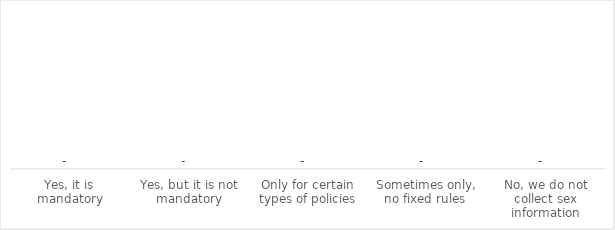
| Category | Series 0 |
|---|---|
| Yes, it is mandatory | 0 |
| Yes, but it is not mandatory | 0 |
| Only for certain types of policies | 0 |
| Sometimes only, no fixed rules  | 0 |
| No, we do not collect sex information | 0 |